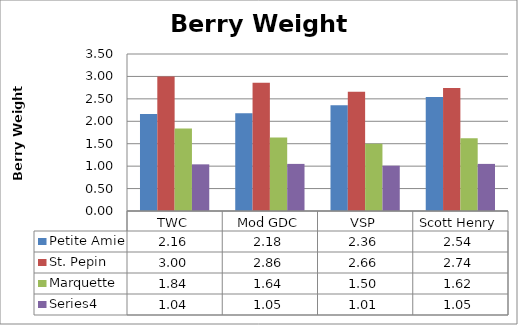
| Category | Petite Amie | St. Pepin | Marquette | Series 3 |
|---|---|---|---|---|
| 0 | 2.16 | 3 | 1.84 | 1.04 |
| 1 | 2.18 | 2.86 | 1.64 | 1.05 |
| 2 | 2.36 | 2.66 | 1.5 | 1.01 |
| 3 | 2.54 | 2.74 | 1.62 | 1.05 |